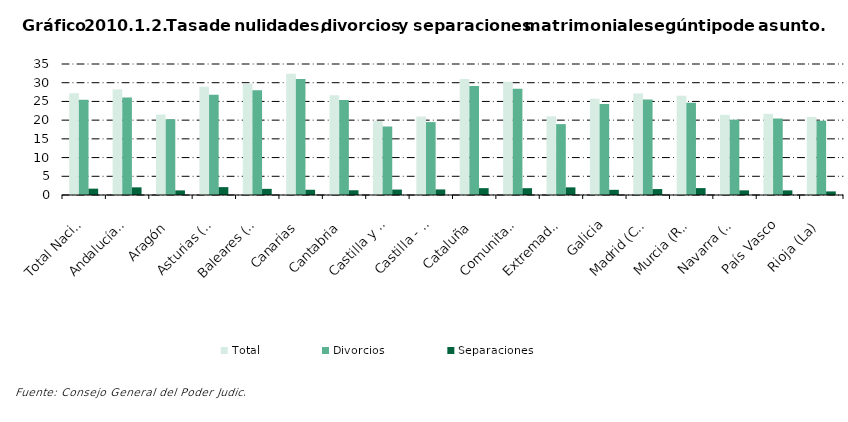
| Category | Total | Divorcios | Separaciones |
|---|---|---|---|
| Total Nacional | 27.154 | 25.426 | 1.693 |
| Andalucía(1) | 28.155 | 26.071 | 2.044 |
| Aragón | 21.498 | 20.221 | 1.232 |
| Asturias (Principado de) | 28.893 | 26.763 | 2.103 |
| Baleares (Illes) | 29.691 | 28.01 | 1.645 |
| Canarias | 32.428 | 30.984 | 1.397 |
| Cantabria | 26.661 | 25.378 | 1.266 |
| Castilla y León | 19.769 | 18.3 | 1.449 |
| Castilla - La Mancha | 20.969 | 19.477 | 1.482 |
| Cataluña | 30.989 | 29.131 | 1.826 |
| Comunitat Valenciana | 30.287 | 28.409 | 1.823 |
| Extremadura | 21.026 | 18.939 | 2.041 |
| Galicia | 25.714 | 24.288 | 1.387 |
| Madrid (Comunidad de) | 27.143 | 25.521 | 1.585 |
| Murcia (Región de) | 26.512 | 24.665 | 1.84 |
| Navarra (Comunidad Foral de) | 21.415 | 20.128 | 1.24 |
| País Vasco | 21.686 | 20.433 | 1.235 |
| Rioja (La) | 20.843 | 19.85 | 0.961 |